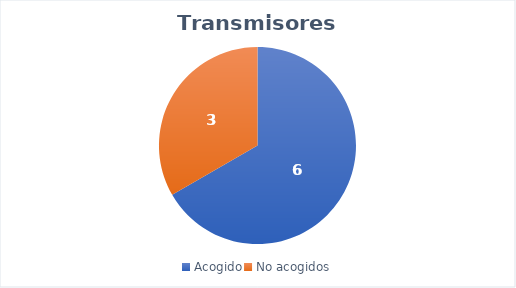
| Category | Series 0 |
|---|---|
| Acogido | 6 |
| No acogidos | 3 |